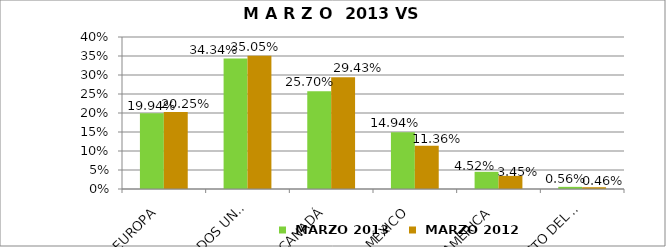
| Category |  MARZO 2013 |  MARZO 2012 |
|---|---|---|
| EUROPA | 0.199 | 0.202 |
| ESTADOS UNIDOS | 0.343 | 0.35 |
| CANADÁ | 0.257 | 0.294 |
| MÉXICO | 0.149 | 0.114 |
| SUDAMERICA | 0.045 | 0.035 |
| RESTO DEL MUNDO | 0.006 | 0.005 |